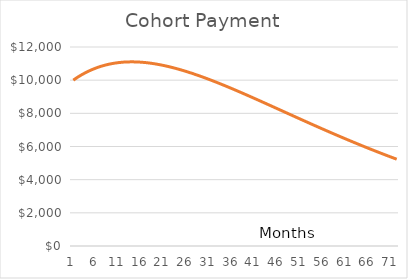
| Category | Cohort Payment |
|---|---|
| 0 | 10000 |
| 1 | 10185 |
| 2 | 10349.9 |
| 3 | 10495.74 |
| 4 | 10623.514 |
| 5 | 10734.175 |
| 6 | 10828.636 |
| 7 | 10907.768 |
| 8 | 10972.407 |
| 9 | 11023.35 |
| 10 | 11061.362 |
| 11 | 11087.172 |
| 12 | 11101.478 |
| 13 | 11104.947 |
| 14 | 11098.217 |
| 15 | 11081.896 |
| 16 | 11056.566 |
| 17 | 11022.782 |
| 18 | 10981.074 |
| 19 | 10931.948 |
| 20 | 10875.887 |
| 21 | 10813.351 |
| 22 | 10744.778 |
| 23 | 10670.588 |
| 24 | 10591.179 |
| 25 | 10506.931 |
| 26 | 10418.206 |
| 27 | 10325.348 |
| 28 | 10228.685 |
| 29 | 10128.529 |
| 30 | 10025.177 |
| 31 | 9918.91 |
| 32 | 9809.996 |
| 33 | 9698.691 |
| 34 | 9585.234 |
| 35 | 9469.856 |
| 36 | 9352.775 |
| 37 | 9234.195 |
| 38 | 9114.312 |
| 39 | 8993.312 |
| 40 | 8871.369 |
| 41 | 8748.648 |
| 42 | 8625.306 |
| 43 | 8501.492 |
| 44 | 8377.343 |
| 45 | 8252.992 |
| 46 | 8128.562 |
| 47 | 8004.17 |
| 48 | 7879.926 |
| 49 | 7755.933 |
| 50 | 7632.288 |
| 51 | 7509.081 |
| 52 | 7386.398 |
| 53 | 7264.317 |
| 54 | 7142.913 |
| 55 | 7022.256 |
| 56 | 6902.409 |
| 57 | 6783.434 |
| 58 | 6665.384 |
| 59 | 6548.313 |
| 60 | 6432.267 |
| 61 | 6317.29 |
| 62 | 6203.423 |
| 63 | 6090.702 |
| 64 | 5979.161 |
| 65 | 5868.832 |
| 66 | 5759.741 |
| 67 | 5651.913 |
| 68 | 5545.371 |
| 69 | 5440.135 |
| 70 | 5336.222 |
| 71 | 5233.648 |